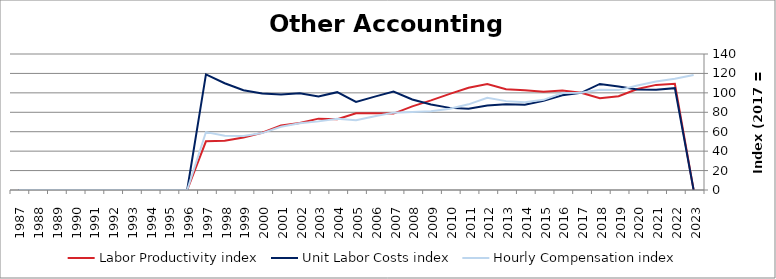
| Category | Labor Productivity index | Unit Labor Costs index | Hourly Compensation index |
|---|---|---|---|
| 2023.0 | 0 | 0 | 118.345 |
| 2022.0 | 109.245 | 104.803 | 114.493 |
| 2021.0 | 108.205 | 103.156 | 111.619 |
| 2020.0 | 103.911 | 103.514 | 107.562 |
| 2019.0 | 96.456 | 106.613 | 102.834 |
| 2018.0 | 94.556 | 109.183 | 103.239 |
| 2017.0 | 100 | 100 | 100 |
| 2016.0 | 102.378 | 97.523 | 99.842 |
| 2015.0 | 101.076 | 91.811 | 92.798 |
| 2014.0 | 102.784 | 87.778 | 90.221 |
| 2013.0 | 103.715 | 88.21 | 91.487 |
| 2012.0 | 109.095 | 87.096 | 95.017 |
| 2011.0 | 105.324 | 83.738 | 88.197 |
| 2010.0 | 98.94 | 84.538 | 83.642 |
| 2009.0 | 92.274 | 87.979 | 81.182 |
| 2008.0 | 86.082 | 93.211 | 80.238 |
| 2007.0 | 78.64 | 101.275 | 79.643 |
| 2006.0 | 78.905 | 96.108 | 75.834 |
| 2005.0 | 79.062 | 90.731 | 71.733 |
| 2004.0 | 72.876 | 100.703 | 73.388 |
| 2003.0 | 73.461 | 96.155 | 70.637 |
| 2002.0 | 68.894 | 99.62 | 68.632 |
| 2001.0 | 66.334 | 98.21 | 65.146 |
| 2000.0 | 59.011 | 99.268 | 58.579 |
| 1999.0 | 54.042 | 102.722 | 55.513 |
| 1998.0 | 50.718 | 109.934 | 55.756 |
| 1997.0 | 50.139 | 118.963 | 59.646 |
| 1996.0 | 0 | 0 | 0 |
| 1995.0 | 0 | 0 | 0 |
| 1994.0 | 0 | 0 | 0 |
| 1993.0 | 0 | 0 | 0 |
| 1992.0 | 0 | 0 | 0 |
| 1991.0 | 0 | 0 | 0 |
| 1990.0 | 0 | 0 | 0 |
| 1989.0 | 0 | 0 | 0 |
| 1988.0 | 0 | 0 | 0 |
| 1987.0 | 0 | 0 | 0 |